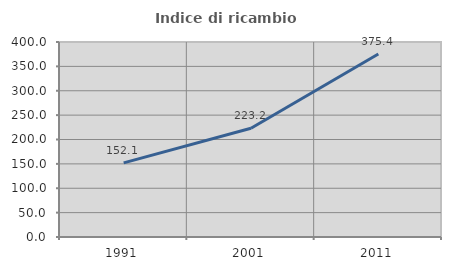
| Category | Indice di ricambio occupazionale  |
|---|---|
| 1991.0 | 152.055 |
| 2001.0 | 223.171 |
| 2011.0 | 375.41 |